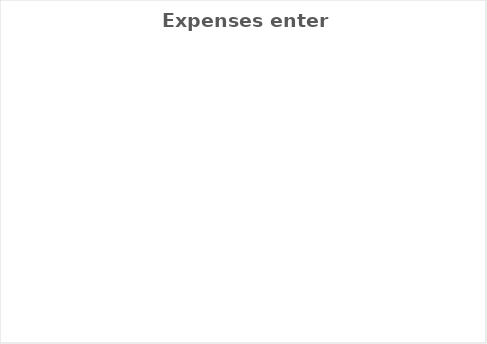
| Category | Actual YTD |
|---|---|
| Administration | 0 |
| Office of President | 0 |
| Programming | 0 |
| Special Events | 0 |
| Membership | 0 |
| Operations | 0 |
| Technology | 0 |